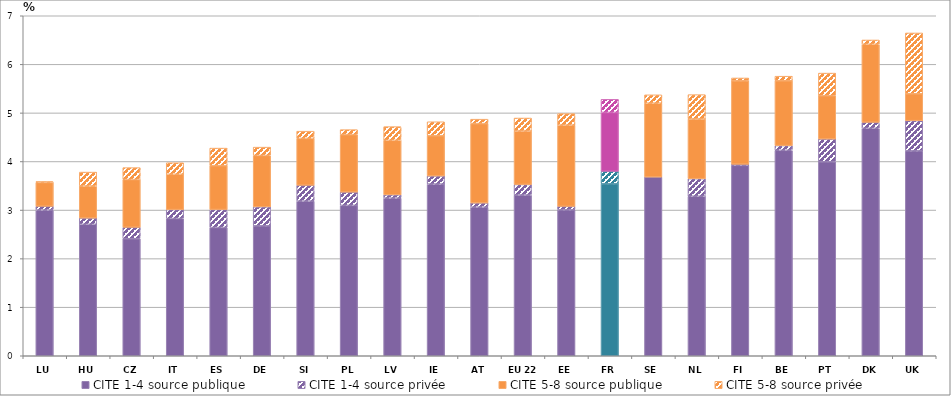
| Category | CITE 1-4 source publique | CITE 1-4 source privée | CITE 5-8 source publique | CITE 5-8 source privée |
|---|---|---|---|---|
| LU | 3 | 0.079 | 0.489 | 0.02 |
| HU | 2.707 | 0.129 | 0.659 | 0.287 |
| CZ | 2.409 | 0.237 | 0.983 | 0.245 |
| IT | 2.826 | 0.183 | 0.727 | 0.237 |
| ES | 2.641 | 0.37 | 0.903 | 0.362 |
| DE | 2.675 | 0.39 | 1.059 | 0.171 |
| SI | 3.184 | 0.327 | 0.964 | 0.149 |
| PL | 3.096 | 0.273 | 1.184 | 0.102 |
| LV | 3.245 | 0.067 | 1.123 | 0.282 |
| IE | 3.534 | 0.168 | 0.828 | 0.287 |
| AT | 3.059 | 0.088 | 1.633 | 0.091 |
| EU 22 | 3.31 | 0.217 | 1.102 | 0.266 |
| EE | 3.004 | 0.072 | 1.674 | 0.236 |
| FR | 3.54 | 0.258 | 1.212 | 0.271 |
| SE | 3.68 | 0 | 1.52 | 0.172 |
| NL | 3.284 | 0.362 | 1.231 | 0.5 |
| FI | 3.919 | 0.025 | 1.717 | 0.058 |
| BE | 4.229 | 0.098 | 1.334 | 0.095 |
| PT | 3.993 | 0.47 | 0.892 | 0.465 |
| DK | 4.684 | 0.123 | 1.608 | 0.087 |
| UK | 4.218 | 0.622 | 0.554 | 1.251 |